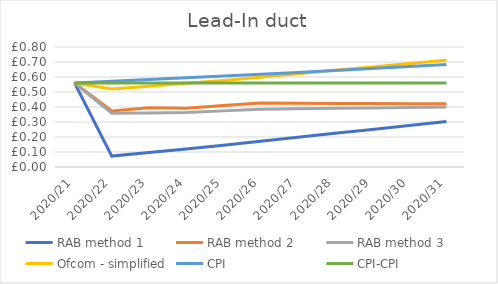
| Category | RAB method 1 | RAB method 2 | RAB method 3 | Ofcom - simplified | CPI | CPI-CPI |
|---|---|---|---|---|---|---|
| 2020/21 | 0.56 | 0.56 | 0.56 | 0.56 | 0.56 | 0.56 |
| 2020/22 | 0.073 | 0.373 | 0.359 | 0.52 | 0.571 | 0.56 |
| 2020/23 | 0.096 | 0.396 | 0.36 | 0.539 | 0.583 | 0.56 |
| 2020/24 | 0.12 | 0.392 | 0.364 | 0.558 | 0.594 | 0.56 |
| 2020/25 | 0.145 | 0.41 | 0.374 | 0.577 | 0.606 | 0.56 |
| 2020/26 | 0.171 | 0.426 | 0.385 | 0.598 | 0.618 | 0.56 |
| 2020/27 | 0.198 | 0.425 | 0.388 | 0.621 | 0.631 | 0.56 |
| 2020/28 | 0.224 | 0.424 | 0.391 | 0.644 | 0.643 | 0.56 |
| 2020/29 | 0.251 | 0.423 | 0.394 | 0.667 | 0.656 | 0.56 |
| 2020/30 | 0.277 | 0.422 | 0.397 | 0.69 | 0.669 | 0.56 |
| 2020/31 | 0.303 | 0.421 | 0.4 | 0.712 | 0.683 | 0.56 |